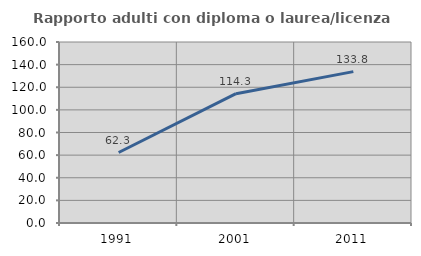
| Category | Rapporto adulti con diploma o laurea/licenza media  |
|---|---|
| 1991.0 | 62.319 |
| 2001.0 | 114.286 |
| 2011.0 | 133.803 |